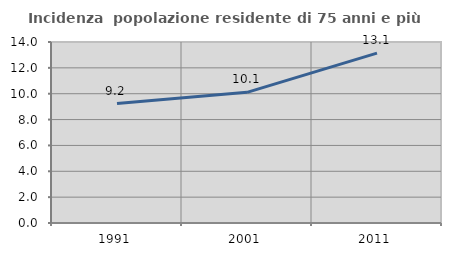
| Category | Incidenza  popolazione residente di 75 anni e più |
|---|---|
| 1991.0 | 9.243 |
| 2001.0 | 10.104 |
| 2011.0 | 13.135 |